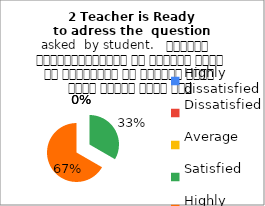
| Category | 2 Teacher is Ready
to adress the  question asked  by student.   शिक्षक विद्यार्थियों के द्वारा पूछे गए प्रश्नों का समाधान करने हेतु तत्पर रहते हैं |
|---|---|
| Highly dissatisfied | 0 |
| Dissatisfied | 0 |
| Average | 0 |
| Satisfied | 5 |
| Highly satisfied | 10 |